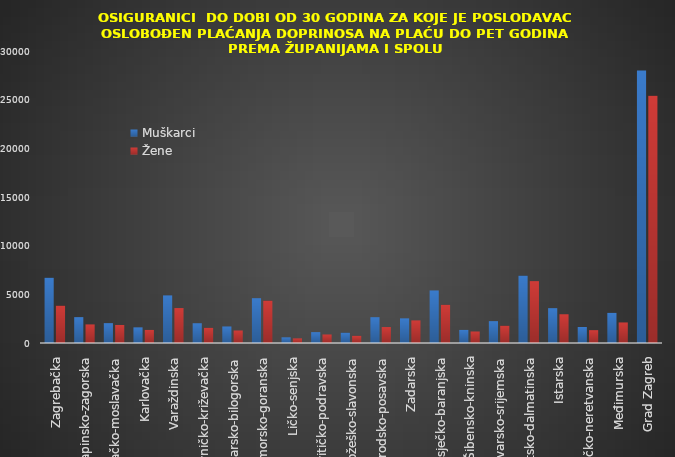
| Category | Muškarci | Žene |
|---|---|---|
| Zagrebačka | 6706 | 3836 |
| Krapinsko-zagorska | 2657 | 1909 |
| Sisačko-moslavačka | 2041 | 1854 |
| Karlovačka | 1607 | 1343 |
| Varaždinska | 4891 | 3591 |
| Koprivničko-križevačka | 2031 | 1560 |
| Bjelovarsko-bilogorska | 1700 | 1285 |
| Primorsko-goranska | 4604 | 4354 |
| Ličko-senjska | 584 | 474 |
| Virovitičko-podravska | 1116 | 876 |
| Požeško-slavonska | 1061 | 742 |
| Brodsko-posavska | 2652 | 1637 |
| Zadarska | 2533 | 2322 |
| Osječko-baranjska | 5400 | 3926 |
| Šibensko-kninska | 1348 | 1182 |
| Vukovarsko-srijemska | 2245 | 1775 |
| Splitsko-dalmatinska | 6922 | 6356 |
| Istarska | 3579 | 2953 |
| Dubrovačko-neretvanska | 1647 | 1320 |
| Međimurska | 3097 | 2111 |
| Grad Zagreb | 28004 | 25414 |